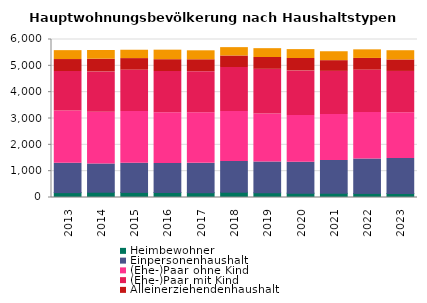
| Category | Heimbewohner | Einpersonenhaushalt | (Ehe-)Paar ohne Kind | (Ehe-)Paar mit Kind | Alleinerziehendenhaushalt | sonstiger Mehrpersonenhaushalt |
|---|---|---|---|---|---|---|
| 2013.0 | 185 | 1115 | 1982 | 1502 | 455 | 338 |
| 2014.0 | 200 | 1073 | 1967 | 1529 | 482 | 332 |
| 2015.0 | 194 | 1106 | 1967 | 1571 | 437 | 317 |
| 2016.0 | 191 | 1100 | 1931 | 1562 | 449 | 362 |
| 2017.0 | 182 | 1115 | 1922 | 1559 | 452 | 341 |
| 2018.0 | 200 | 1169 | 1898 | 1670 | 437 | 317 |
| 2019.0 | 176 | 1169 | 1826 | 1697 | 449 | 335 |
| 2020.0 | 164 | 1172 | 1775 | 1697 | 470 | 338 |
| 2021.0 | 158 | 1250 | 1742 | 1640 | 407 | 338 |
| 2022.0 | 155 | 1307 | 1763 | 1613 | 443 | 326 |
| 2023.0 | 152 | 1331 | 1733 | 1571 | 437 | 350 |